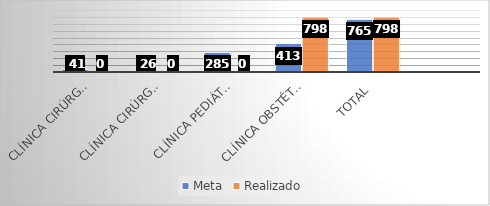
| Category | Meta | Realizado |
|---|---|---|
| Clínica Cirúrgica Pediátrica | 41 | 0 |
| Clínica Cirúrgica CERFIS | 26 | 0 |
| Clínica Pediátrica | 285 | 0 |
| Clínica Obstétrica | 413 | 798 |
| Total | 765 | 798 |